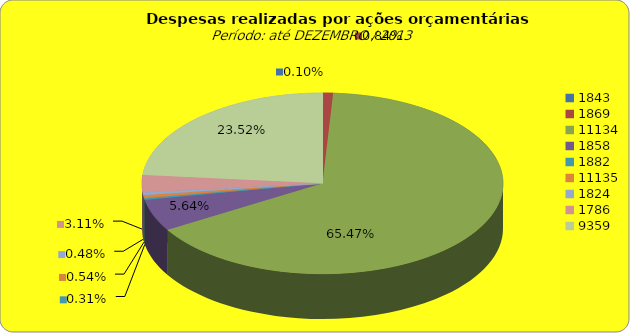
| Category | Series 1 |
|---|---|
| 1843.0 | 161802.31 |
| 1869.0 | 1407407.96 |
| 11134.0 | 109753264.92 |
| 1858.0 | 9450180.69 |
| 1882.0 | 519790.22 |
| 11135.0 | 905329.12 |
| 1824.0 | 798767.85 |
| 1786.0 | 5210151.59 |
| 9359.0 | 39429068.78 |